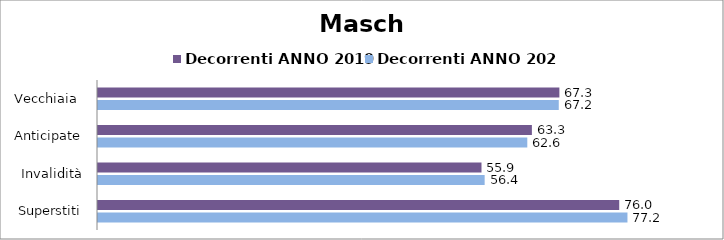
| Category | Decorrenti ANNO 2019 | Decorrenti ANNO 2020 |
|---|---|---|
| Vecchiaia  | 67.3 | 67.21 |
|  Anticipate | 63.29 | 62.62 |
| Invalidità | 55.94 | 56.4 |
| Superstiti | 76.03 | 77.23 |